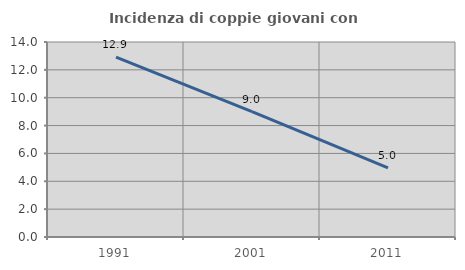
| Category | Incidenza di coppie giovani con figli |
|---|---|
| 1991.0 | 12.92 |
| 2001.0 | 9 |
| 2011.0 | 4.963 |